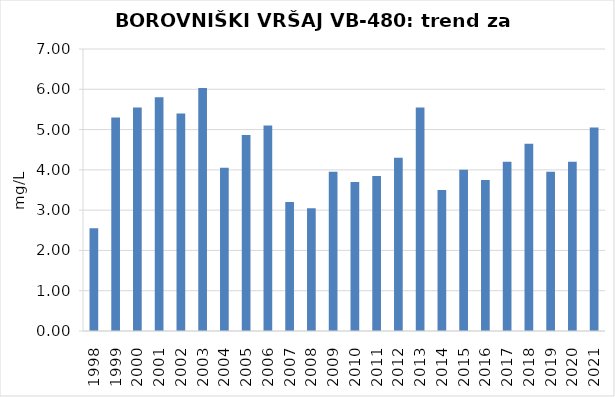
| Category | Vsota |
|---|---|
| 1998 | 2.55 |
| 1999 | 5.3 |
| 2000 | 5.55 |
| 2001 | 5.8 |
| 2002 | 5.4 |
| 2003 | 6.033 |
| 2004 | 4.05 |
| 2005 | 4.867 |
| 2006 | 5.1 |
| 2007 | 3.2 |
| 2008 | 3.05 |
| 2009 | 3.95 |
| 2010 | 3.7 |
| 2011 | 3.85 |
| 2012 | 4.3 |
| 2013 | 5.55 |
| 2014 | 3.5 |
| 2015 | 4 |
| 2016 | 3.75 |
| 2017 | 4.2 |
| 2018 | 4.65 |
| 2019 | 3.95 |
| 2020 | 4.2 |
| 2021 | 5.05 |